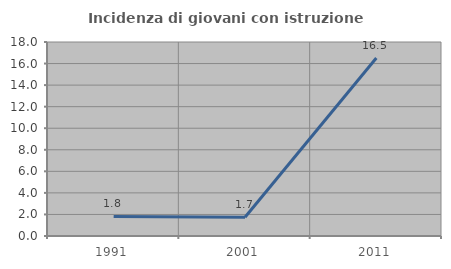
| Category | Incidenza di giovani con istruzione universitaria |
|---|---|
| 1991.0 | 1.818 |
| 2001.0 | 1.739 |
| 2011.0 | 16.522 |